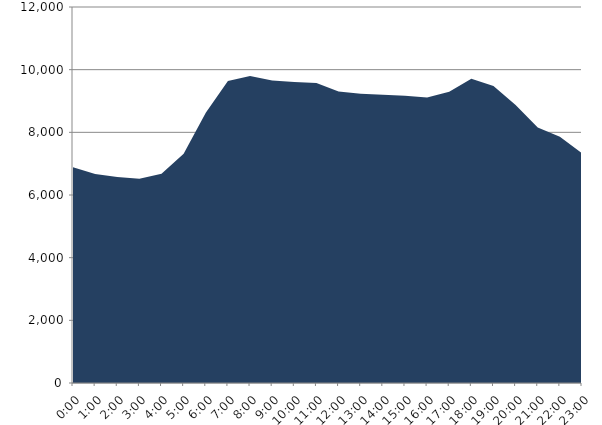
| Category | Series 0 | Series 1 |
|---|---|---|
| 2018-10-17 |  | 6882.75 |
| 2018-10-17 01:00:00 |  | 6666.68 |
| 2018-10-17 02:00:00 |  | 6578.01 |
| 2018-10-17 03:00:00 |  | 6520.65 |
| 2018-10-17 04:00:00 |  | 6678.63 |
| 2018-10-17 05:00:00 |  | 7312.95 |
| 2018-10-17 06:00:00 |  | 8622.8 |
| 2018-10-17 07:00:00 |  | 9634.93 |
| 2018-10-17 08:00:00 |  | 9798.48 |
| 2018-10-17 09:00:00 |  | 9651.2 |
| 2018-10-17 10:00:00 |  | 9603.57 |
| 2018-10-17 11:00:00 |  | 9571.2 |
| 2018-10-17 12:00:00 |  | 9302.22 |
| 2018-10-17 13:00:00 |  | 9230.89 |
| 2018-10-17 14:00:00 |  | 9198.75 |
| 2018-10-17 15:00:00 |  | 9165.16 |
| 2018-10-17 16:00:00 |  | 9109.57 |
| 2018-10-17 17:00:00 |  | 9295.6 |
| 2018-10-17 18:00:00 |  | 9709.97 |
| 2018-10-17 19:00:00 |  | 9482.61 |
| 2018-10-17 20:00:00 |  | 8869.67 |
| 2018-10-17 21:00:00 |  | 8157.4 |
| 2018-10-17 22:00:00 |  | 7858.75 |
| 2018-10-17 23:00:00 |  | 7333.84 |